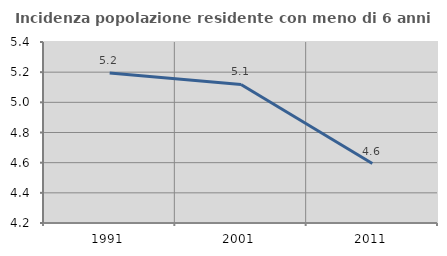
| Category | Incidenza popolazione residente con meno di 6 anni |
|---|---|
| 1991.0 | 5.195 |
| 2001.0 | 5.118 |
| 2011.0 | 4.594 |